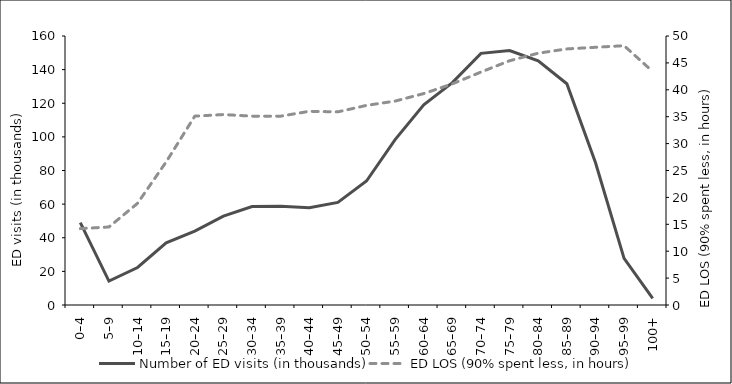
| Category | Number of ED visits (in thousands) |
|---|---|
| 0–4 | 49.044 |
| 5–9 | 14.252 |
| 10–14 | 22.302 |
| 15–19 | 37.018 |
| 20–24 | 43.897 |
| 25–29 | 52.858 |
| 30–34 | 58.529 |
| 35–39 | 58.796 |
| 40–44 | 57.833 |
| 45–49 | 60.999 |
| 50–54 | 73.739 |
| 55–59 | 98.397 |
| 60–64 | 119.089 |
| 65–69 | 132.292 |
| 70–74 | 149.664 |
| 75–79 | 151.385 |
| 80–84 | 145.253 |
| 85–89 | 131.607 |
| 90–94 | 84.742 |
| 95–99 | 27.742 |
| 100+ | 3.9 |